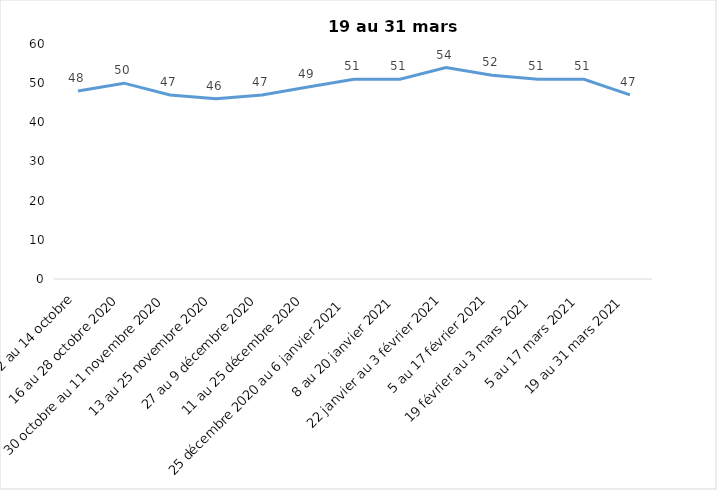
| Category | Toujours aux trois mesures |
|---|---|
| 2 au 14 octobre | 48 |
| 16 au 28 octobre 2020 | 50 |
| 30 octobre au 11 novembre 2020 | 47 |
| 13 au 25 novembre 2020 | 46 |
| 27 au 9 décembre 2020 | 47 |
| 11 au 25 décembre 2020 | 49 |
| 25 décembre 2020 au 6 janvier 2021 | 51 |
| 8 au 20 janvier 2021 | 51 |
| 22 janvier au 3 février 2021 | 54 |
| 5 au 17 février 2021 | 52 |
| 19 février au 3 mars 2021 | 51 |
| 5 au 17 mars 2021 | 51 |
| 19 au 31 mars 2021 | 47 |